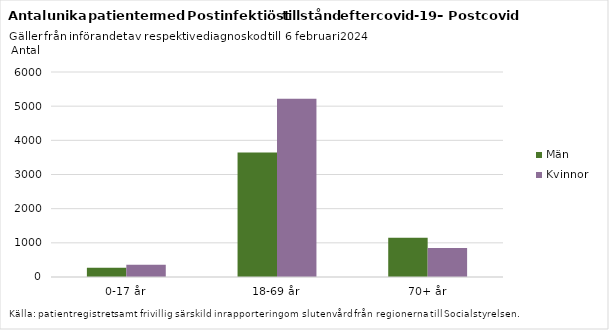
| Category | Män | Kvinnor |
|---|---|---|
| 0-17 år | 270 | 358 |
| 18-69 år | 3643 | 5217 |
| 70+ år | 1146 | 850 |